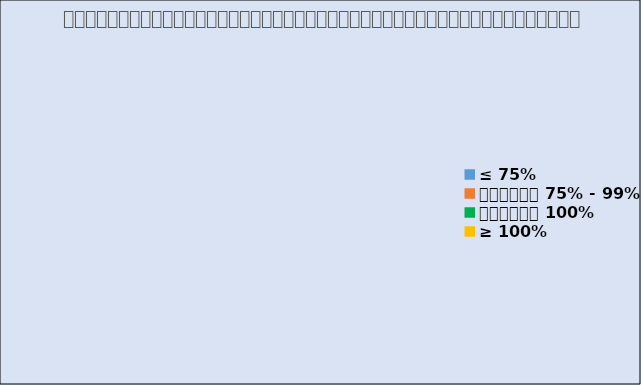
| Category | Percentage  |
|---|---|
| ≤ 75% | 0 |
| ចន្លោះ 75% - 99% | 0 |
| ពេញលេញ 100% | 0 |
| ≥ 100% | 0 |